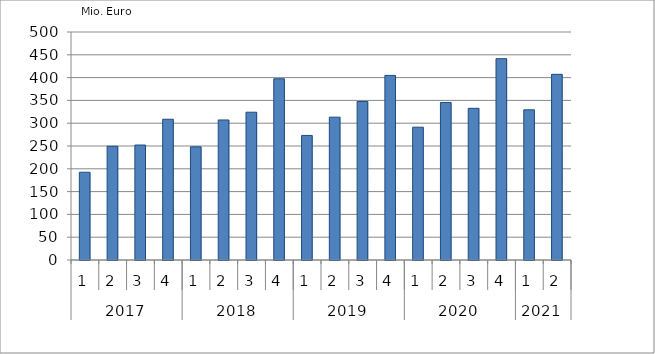
| Category | Ausbaugewerblicher Umsatz3 |
|---|---|
| 0 | 192499.539 |
| 1 | 249394.388 |
| 2 | 252146.755 |
| 3 | 308653.153 |
| 4 | 248133.418 |
| 5 | 307099.899 |
| 6 | 324088.989 |
| 7 | 397377.201 |
| 8 | 273159.137 |
| 9 | 313254.251 |
| 10 | 347631.281 |
| 11 | 404721.054 |
| 12 | 291272.144 |
| 13 | 345494.215 |
| 14 | 332629.265 |
| 15 | 441463.36 |
| 16 | 329380.212 |
| 17 | 407164.972 |